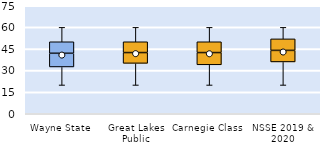
| Category | 25th | 50th | 75th |
|---|---|---|---|
| Wayne State | 32.5 | 9.5 | 8 |
| Great Lakes Public | 35 | 7.5 | 7.5 |
| Carnegie Class | 34 | 8.5 | 7.5 |
| NSSE 2019 & 2020 | 36 | 8 | 8 |